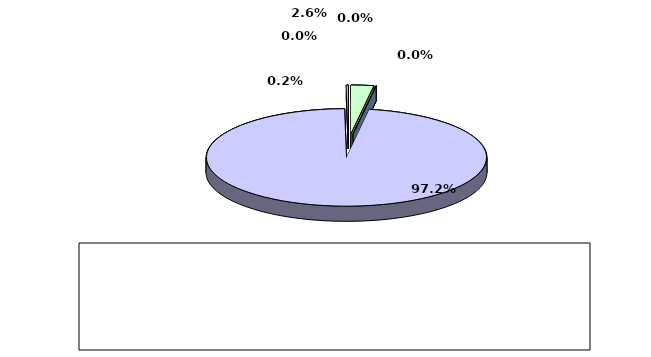
| Category | Series 0 |
|---|---|
| מזומנים ושווי מזומנים | 0.026 |
| אג"ח ממשלתיות סחירות | 0 |
| אג"ח קונצרני סחיר | 0 |
| ני"ע אחרים סחירים | 0.972 |
| פקדונות והלוואות | 0 |
| השקעות אחרות | 0.002 |